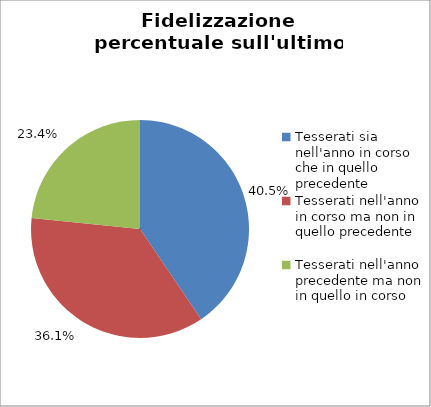
| Category | Nr. Tesserati |
|---|---|
| Tesserati sia nell'anno in corso che in quello precedente | 293 |
| Tesserati nell'anno in corso ma non in quello precedente | 261 |
| Tesserati nell'anno precedente ma non in quello in corso | 169 |